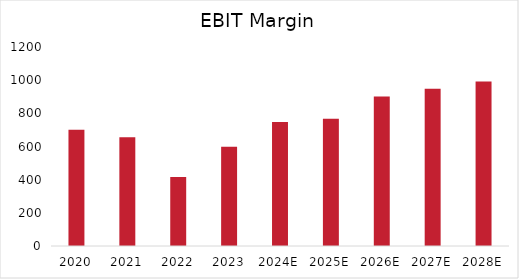
| Category | Series 0 |
|---|---|
| 2020 | 700.5 |
| 2021 | 655.7 |
| 2022 | 415.6 |
| 2023 | 598.9 |
| 2024E | 747.054 |
| 2025E | 766.728 |
| 2026E | 901.821 |
| 2027E | 948.676 |
| 2028E | 991.348 |